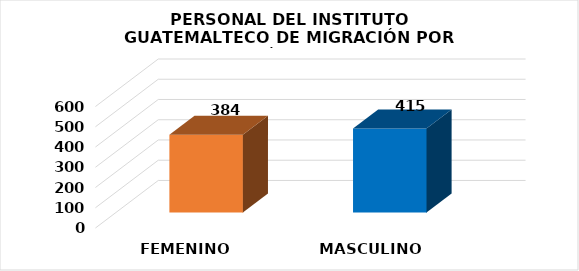
| Category | Series 0 |
|---|---|
| FEMENINO | 384 |
| MASCULINO | 415 |